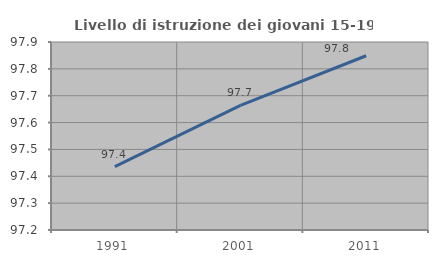
| Category | Livello di istruzione dei giovani 15-19 anni |
|---|---|
| 1991.0 | 97.436 |
| 2001.0 | 97.664 |
| 2011.0 | 97.849 |